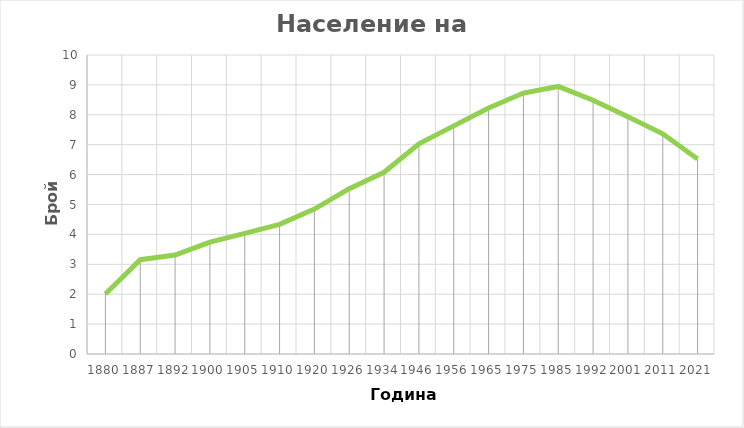
| Category | Население на България |
|---|---|
| 1880.0 | 2.008 |
| 1887.0 | 3.154 |
| 1892.0 | 3.311 |
| 1900.0 | 3.744 |
| 1905.0 | 4.036 |
| 1910.0 | 4.338 |
| 1920.0 | 4.847 |
| 1926.0 | 5.529 |
| 1934.0 | 6.078 |
| 1946.0 | 7.029 |
| 1956.0 | 7.629 |
| 1965.0 | 8.228 |
| 1975.0 | 8.728 |
| 1985.0 | 8.949 |
| 1992.0 | 8.487 |
| 2001.0 | 7.933 |
| 2011.0 | 7.365 |
| 2021.0 | 6.52 |